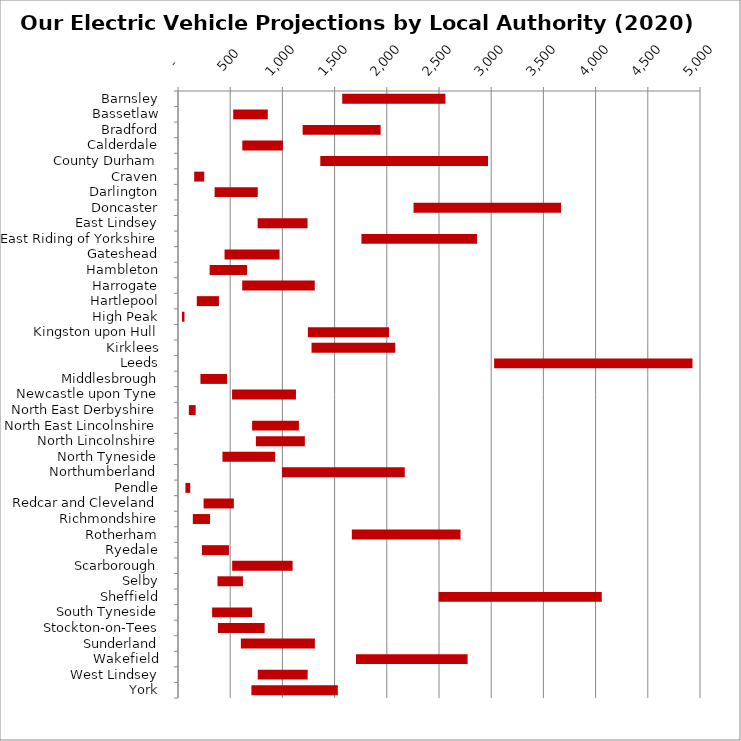
| Category | MIN | MAX |
|---|---|---|
| Barnsley | 1573 | 988 |
| Bassetlaw | 529 | 331 |
| Bradford | 1194 | 747 |
| Calderdale | 616 | 389 |
| County Durham | 1363 | 1607 |
| Craven | 155 | 96 |
| Darlington | 351 | 413 |
| Doncaster | 2256 | 1413 |
| East Lindsey | 763 | 478 |
| East Riding of Yorkshire | 1757 | 1107 |
| Gateshead | 446 | 527 |
| Hambleton | 303 | 358 |
| Harrogate | 615 | 695 |
| Hartlepool | 180 | 212 |
| High Peak | 38 | 24 |
| Kingston upon Hull | 1244 | 777 |
| Kirklees | 1279 | 802 |
| Leeds | 3028 | 1900 |
| Middlesbrough | 215 | 255 |
| Newcastle upon Tyne | 518 | 612 |
| North East Derbyshire | 104 | 65 |
| North East Lincolnshire | 710 | 448 |
| North Lincolnshire | 746 | 469 |
| North Tyneside | 426 | 504 |
| Northumberland | 996 | 1176 |
| Pendle | 71 | 46 |
| Redcar and Cleveland | 245 | 290 |
| Richmondshire | 142 | 165 |
| Rotherham | 1665 | 1041 |
| Ryedale | 229 | 259 |
| Scarborough | 519 | 579 |
| Selby | 378 | 244 |
| Sheffield | 2496 | 1563 |
| South Tyneside | 327 | 383 |
| Stockton-on-Tees | 382 | 448 |
| Sunderland | 602 | 709 |
| Wakefield | 1705 | 1069 |
| West Lindsey | 764 | 478 |
| York | 703 | 828 |